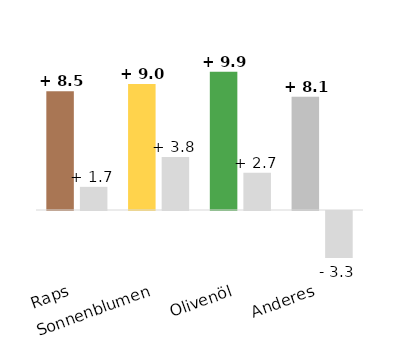
| Category | in % |
|---|---|
| Raps | 1.654 |
| Sonnenblumen | 3.781 |
| Olivenöl | 2.655 |
| Anderes | -3.349 |